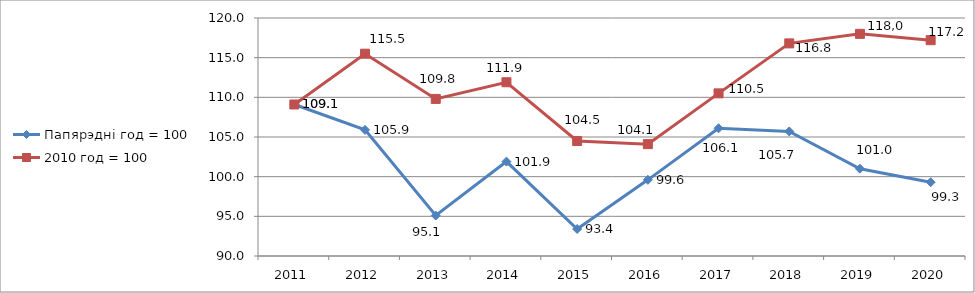
| Category | Папярэдні год = 100 | 2010 год = 100 |
|---|---|---|
| 0 | 109.1 |  |
| 1 | 105.9 |  |
| 2 | 95.1 |  |
| 3 | 101.9 |  |
| 4 | 93.4 |  |
| 5 | 99.6 |  |
| 6 | 106.1 |  |
| 7 | 105.7 |  |
| 8 | 101 |  |
| 9 | 99.3 |  |